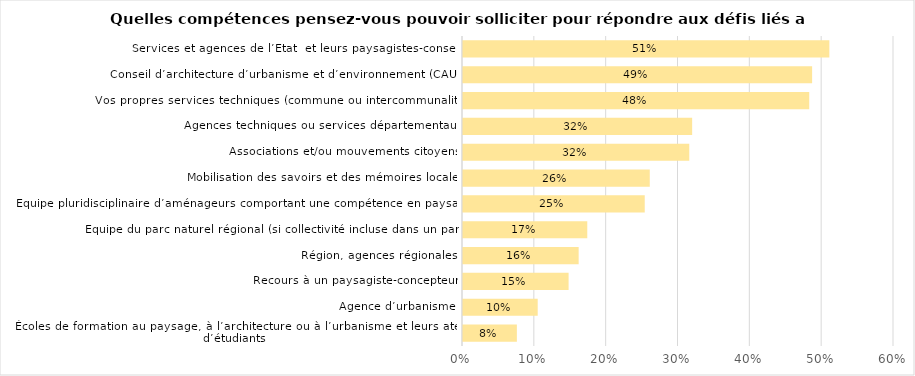
| Category | Series 0 |
|---|---|
| Écoles de formation au paysage, à l’architecture ou à l’urbanisme et leurs ateliers d’étudiants  | 0.075 |
| Agence d’urbanisme  | 0.104 |
| Recours à un paysagiste-concepteur  | 0.147 |
| Région, agences régionales  | 0.161 |
| Équipe du parc naturel régional (si collectivité incluse dans un parc)  | 0.173 |
| Équipe pluridisciplinaire d’aménageurs comportant une compétence en paysage  | 0.253 |
| Mobilisation des savoirs et des mémoires locales  | 0.26 |
| Associations et/ou mouvements citoyens  | 0.315 |
| Agences techniques ou services départementaux  | 0.319 |
| Vos propres services techniques (commune ou intercommunalité)  | 0.482 |
| Conseil d’architecture d’urbanisme et d’environnement (CAUE)  | 0.486 |
| Services et agences de l’État  et leurs paysagistes-conseils  | 0.51 |